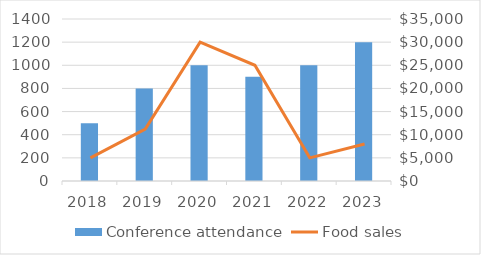
| Category | Conference attendance |
|---|---|
| 2018.0 | 500 |
| 2019.0 | 800 |
| 2020.0 | 1000 |
| 2021.0 | 900 |
| 2022.0 | 1000 |
| 2023.0 | 1200 |